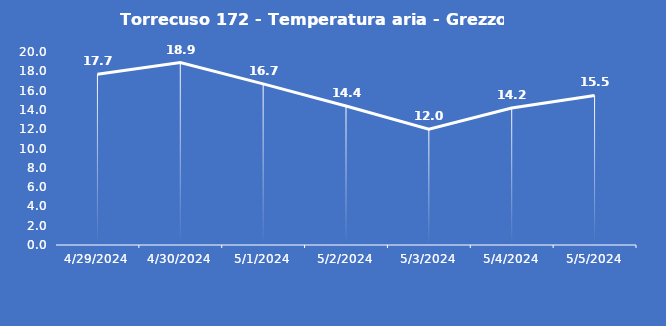
| Category | Torrecuso 172 - Temperatura aria - Grezzo (°C) |
|---|---|
| 4/29/24 | 17.7 |
| 4/30/24 | 18.9 |
| 5/1/24 | 16.7 |
| 5/2/24 | 14.4 |
| 5/3/24 | 12 |
| 5/4/24 | 14.2 |
| 5/5/24 | 15.5 |